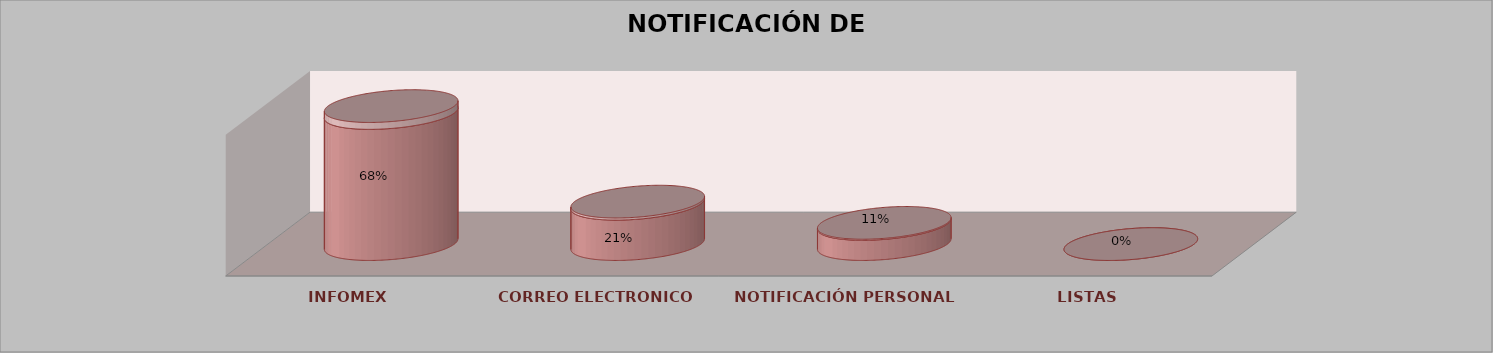
| Category | Series 0 | Series 1 | Series 2 | Series 3 | Series 4 |
|---|---|---|---|---|---|
| INFOMEX |  |  |  | 13 | 0.684 |
| CORREO ELECTRONICO |  |  |  | 4 | 0.211 |
| NOTIFICACIÓN PERSONAL |  |  |  | 2 | 0.105 |
| LISTAS |  |  |  | 0 | 0 |